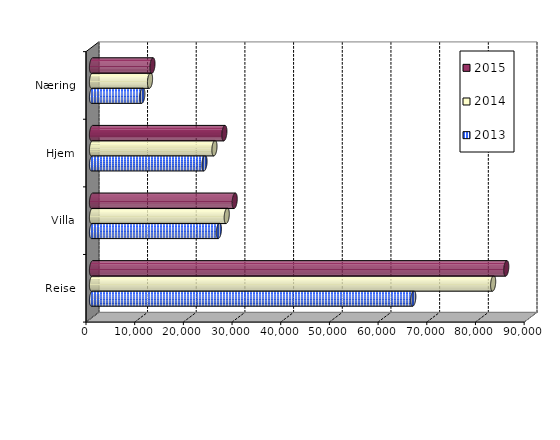
| Category | 2013 | 2014 | 2015 |
|---|---|---|---|
| Reise | 65994.352 | 82399 | 85093 |
| Villa | 26063.869 | 27679 | 29310 |
| Hjem | 23110.983 | 25150 | 27189 |
| Næring | 10340.01 | 11918 | 12417 |